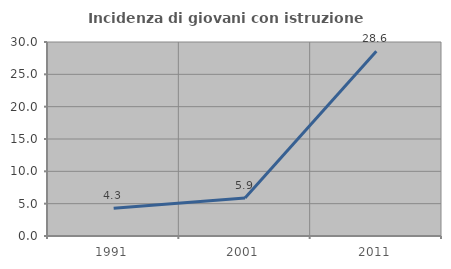
| Category | Incidenza di giovani con istruzione universitaria |
|---|---|
| 1991.0 | 4.301 |
| 2001.0 | 5.882 |
| 2011.0 | 28.571 |